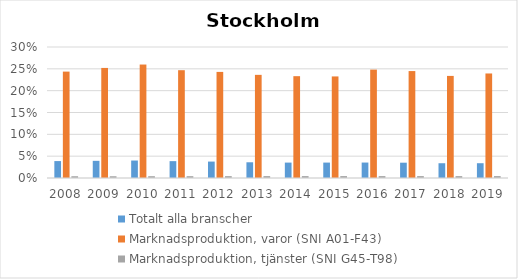
| Category | Totalt alla branscher | Marknadsproduktion, varor (SNI A01-F43) | Marknadsproduktion, tjänster (SNI G45-T98) |
|---|---|---|---|
| 2008.0 | 0.039 | 0.244 | 0.004 |
| 2009.0 | 0.039 | 0.252 | 0.004 |
| 2010.0 | 0.04 | 0.26 | 0.004 |
| 2011.0 | 0.039 | 0.247 | 0.004 |
| 2012.0 | 0.038 | 0.243 | 0.004 |
| 2013.0 | 0.036 | 0.236 | 0.004 |
| 2014.0 | 0.035 | 0.233 | 0.004 |
| 2015.0 | 0.035 | 0.233 | 0.004 |
| 2016.0 | 0.035 | 0.248 | 0.004 |
| 2017.0 | 0.035 | 0.245 | 0.004 |
| 2018.0 | 0.034 | 0.234 | 0.004 |
| 2019.0 | 0.034 | 0.239 | 0.004 |